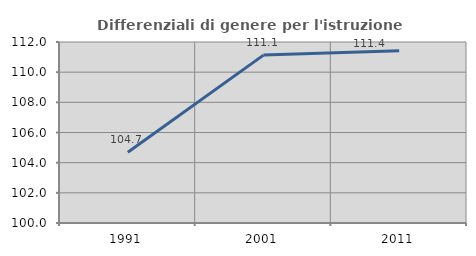
| Category | Differenziali di genere per l'istruzione superiore |
|---|---|
| 1991.0 | 104.686 |
| 2001.0 | 111.131 |
| 2011.0 | 111.425 |